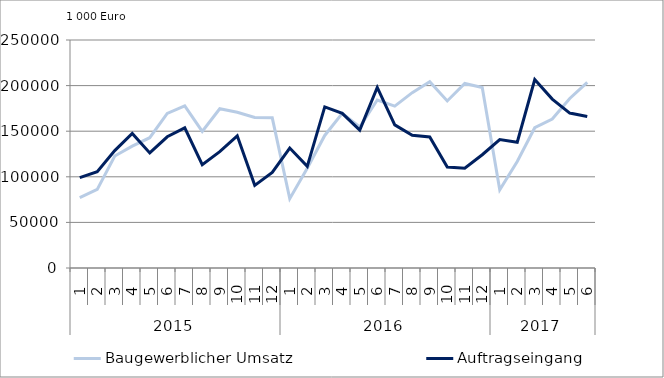
| Category | Baugewerblicher Umsatz | Auftragseingang |
|---|---|---|
| 0 | 77137.228 | 99023.008 |
| 1 | 86257.027 | 105491.844 |
| 2 | 122760.234 | 128704.324 |
| 3 | 133614.814 | 147438.665 |
| 4 | 142869.83 | 126182.175 |
| 5 | 169564.381 | 143879.815 |
| 6 | 177708.819 | 153660.001 |
| 7 | 149762.789 | 113338.261 |
| 8 | 174633.481 | 127520.775 |
| 9 | 170827.145 | 144931.886 |
| 10 | 165122.384 | 90621.16 |
| 11 | 164674.971 | 104795.622 |
| 12 | 76043.538 | 131571.482 |
| 13 | 109483.268 | 111467.248 |
| 14 | 145343.559 | 176673.268 |
| 15 | 169660.551 | 169566.96 |
| 16 | 154554.865 | 151228.165 |
| 17 | 184236.137 | 198035.655 |
| 18 | 177444.278 | 156900.898 |
| 19 | 192230.472 | 145537.167 |
| 20 | 204178.065 | 143616.217 |
| 21 | 183173.849 | 110770.94 |
| 22 | 202302.279 | 109384.188 |
| 23 | 197832.096 | 124193.91 |
| 24 | 85701.947 | 140751.008 |
| 25 | 116743.276 | 137863.383 |
| 26 | 153810.055 | 206710.579 |
| 27 | 163342.989 | 185183.797 |
| 28 | 185946.221 | 169878.51 |
| 29 | 203627.91 | 166148.392 |